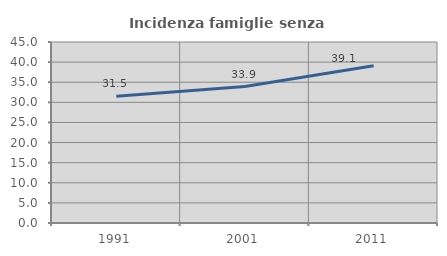
| Category | Incidenza famiglie senza nuclei |
|---|---|
| 1991.0 | 31.484 |
| 2001.0 | 33.919 |
| 2011.0 | 39.116 |